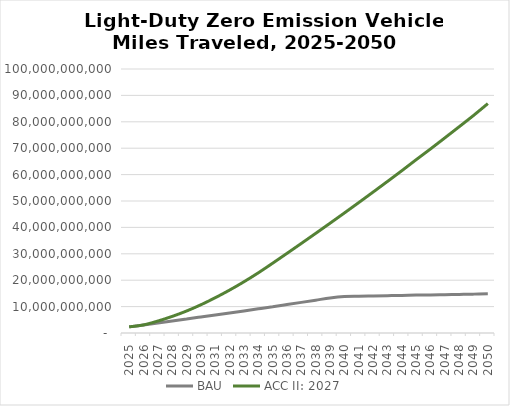
| Category | BAU | ACC II: 2027 |
|---|---|---|
| 2025.0 | 2324945381.577 | 2324945381.577 |
| 2026.0 | 3059442212.981 | 3059442212.981 |
| 2027.0 | 3800315533.614 | 4528641826.193 |
| 2028.0 | 4547521704.486 | 6282841167.279 |
| 2029.0 | 5301032242.975 | 8325616979.152 |
| 2030.0 | 6060817055.288 | 10694873803.711 |
| 2031.0 | 6822548497.211 | 13357364696.883 |
| 2032.0 | 7592439245.637 | 16258366296.31 |
| 2033.0 | 8370507122.535 | 19401953730.906 |
| 2034.0 | 9156763599.896 | 22792203572.872 |
| 2035.0 | 9951220243.774 | 26433205253.346 |
| 2036.0 | 10773233393.834 | 30161089973.733 |
| 2037.0 | 11603509191.489 | 33927773533.989 |
| 2038.0 | 12442002892.085 | 37733075401.954 |
| 2039.0 | 13288704815.315 | 41576918027.669 |
| 2040.0 | 13832125159.728 | 45458987280.425 |
| 2041.0 | 13959975990.911 | 49393038726.272 |
| 2042.0 | 14055677498.795 | 53369926011.736 |
| 2043.0 | 14151359285.084 | 57389537726.888 |
| 2044.0 | 14247021349.778 | 61451763307.789 |
| 2045.0 | 14358677443.288 | 65629687613.104 |
| 2046.0 | 14438347128.423 | 69702322008.374 |
| 2047.0 | 14534011660.17 | 73890371022 |
| 2048.0 | 14629657288.118 | 78120532606.895 |
| 2049.0 | 14725284012.266 | 82392700117.261 |
| 2050.0 | 14852903743.61 | 86894047223.456 |